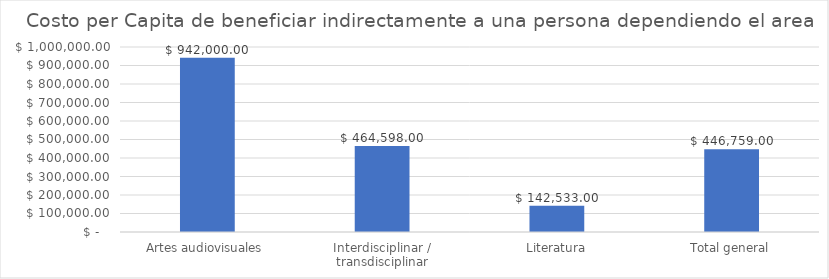
| Category | Promedio de Costo percapita beneficiario indirecto |
|---|---|
| Artes audiovisuales | 942000 |
| Interdisciplinar / transdisciplinar | 464598 |
| Literatura | 142533 |
| Total general | 446759 |